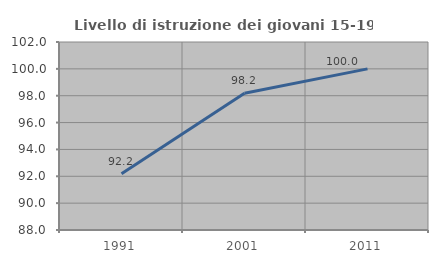
| Category | Livello di istruzione dei giovani 15-19 anni |
|---|---|
| 1991.0 | 92.188 |
| 2001.0 | 98.182 |
| 2011.0 | 100 |